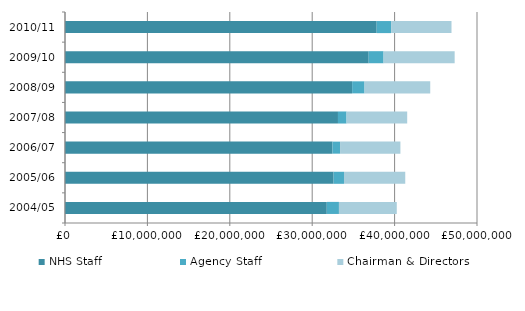
| Category | NHS Staff | Agency Staff | Chairman & Directors |
|---|---|---|---|
| 2004/05 | 31769301.638 | 1476262.445 | 7018981.579 |
| 2005/06 | 32596060.956 | 1261692.681 | 7434909.902 |
| 2006/07 | 32455037.132 | 925325.176 | 7324709.95 |
| 2007/08 | 33126863 | 1041135 | 7360897 |
| 2008/09 | 34845222 | 1506515 | 7972458 |
| 2009/10 | 36855076 | 1804668 | 8629035 |
| 2010/11 | 37824774 | 1753583 | 7326514 |